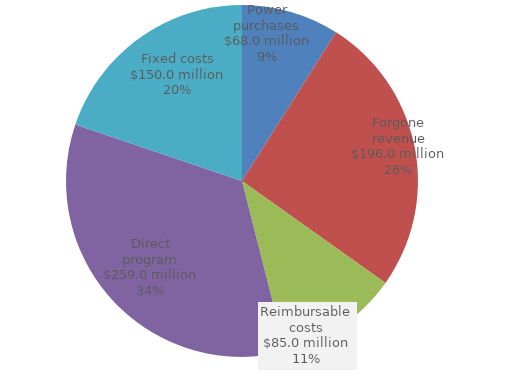
| Category | Series 0 |
|---|---|
| Power purchases | 68 |
| Forgone revenue | 196 |
| Reimbursable costs | 85 |
| Direct program | 259 |
| Fixed costs | 150 |